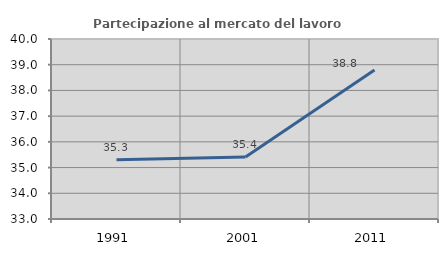
| Category | Partecipazione al mercato del lavoro  femminile |
|---|---|
| 1991.0 | 35.306 |
| 2001.0 | 35.408 |
| 2011.0 | 38.794 |